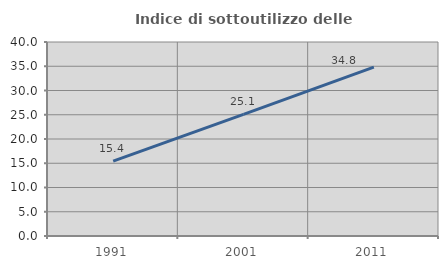
| Category | Indice di sottoutilizzo delle abitazioni  |
|---|---|
| 1991.0 | 15.431 |
| 2001.0 | 25.085 |
| 2011.0 | 34.815 |